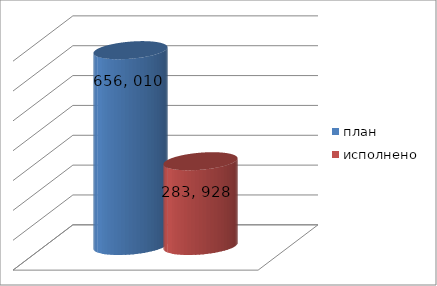
| Category | план | исполнено |
|---|---|---|
| 0 | 656010952.29 | 283928277.84 |